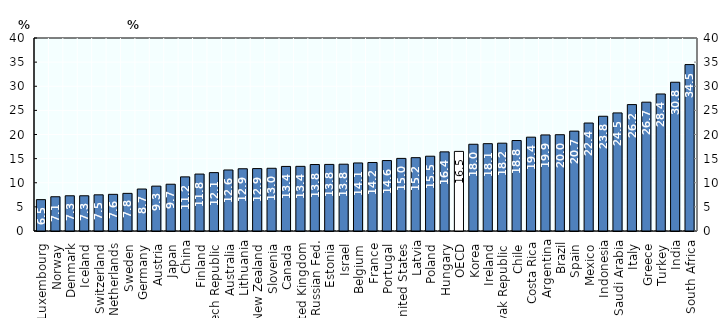
| Category | NEETs 2014 |
|---|---|
| Luxembourg  | 6.5 |
| Norway  | 7.1 |
| Denmark  | 7.3 |
| Iceland  | 7.3 |
| Switzerland  | 7.5 |
| Netherlands  | 7.6 |
| Sweden  | 7.8 |
| Germany  | 8.7 |
| Austria  | 9.3 |
| Japan  | 9.693 |
| China | 11.219 |
| Finland  | 11.8 |
| Czech Republic  | 12.1 |
| Australia  | 12.647 |
| Lithuania | 12.9 |
| New Zealand  | 12.937 |
| Slovenia  | 13 |
| Canada  | 13.381 |
| United Kingdom  | 13.4 |
| Russian Fed. | 13.777 |
| Estonia  | 13.8 |
| Israel  | 13.846 |
| Belgium  | 14.1 |
| France  | 14.2 |
| Portugal  | 14.6 |
| United States  | 15.047 |
| Latvia | 15.2 |
| Poland  | 15.5 |
| Hungary  | 16.4 |
| OECD  | 16.499 |
| Korea  | 17.976 |
| Ireland  | 18.1 |
| Slovak Republic  | 18.2 |
| Chile  | 18.751 |
| Costa Rica | 19.444 |
| Argentina | 19.912 |
| Brazil | 19.955 |
| Spain  | 20.7 |
| Mexico  | 22.378 |
| Indonesia | 23.781 |
| Saudi Arabia | 24.475 |
| Italy  | 26.2 |
| Greece  | 26.7 |
| Turkey  | 28.4 |
| India | 30.832 |
| South Africa | 34.491 |